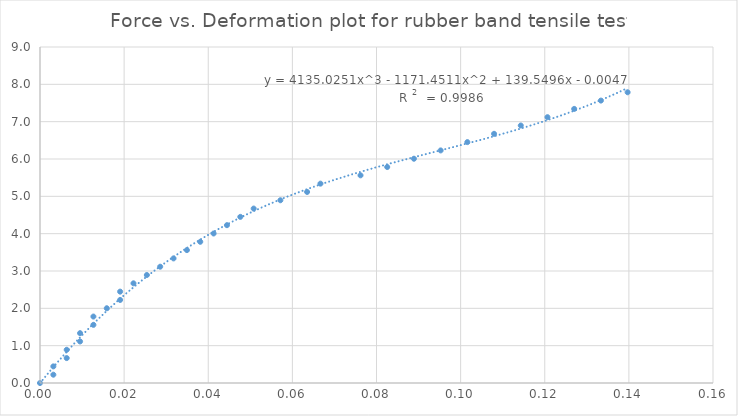
| Category | Series 0 |
|---|---|
| 0.0 | 0 |
| 0.003175 | 0.222 |
| 0.003175 | 0.445 |
| 0.00635 | 0.667 |
| 0.00635 | 0.89 |
| 0.009524999999999999 | 1.112 |
| 0.009524999999999999 | 1.335 |
| 0.0127 | 1.557 |
| 0.0127 | 1.78 |
| 0.015875 | 2.002 |
| 0.019049999999999997 | 2.225 |
| 0.019049999999999997 | 2.447 |
| 0.022224999999999998 | 2.67 |
| 0.0254 | 2.892 |
| 0.028575 | 3.115 |
| 0.03175 | 3.337 |
| 0.034925 | 3.56 |
| 0.038099999999999995 | 3.782 |
| 0.041275 | 4.005 |
| 0.044449999999999996 | 4.227 |
| 0.047625 | 4.45 |
| 0.0508 | 4.672 |
| 0.05715 | 4.895 |
| 0.0635 | 5.117 |
| 0.066675 | 5.34 |
| 0.07619999999999999 | 5.562 |
| 0.08255 | 5.785 |
| 0.08889999999999999 | 6.007 |
| 0.09525 | 6.23 |
| 0.1016 | 6.452 |
| 0.10794999999999999 | 6.675 |
| 0.1143 | 6.897 |
| 0.12065 | 7.12 |
| 0.127 | 7.342 |
| 0.13335 | 7.565 |
| 0.1397 | 7.787 |